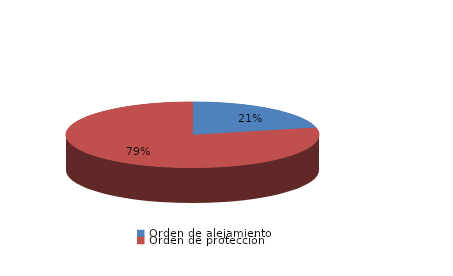
| Category | Series 0 |
|---|---|
| Orden de alejamiento | 6 |
| Orden de protección | 22 |